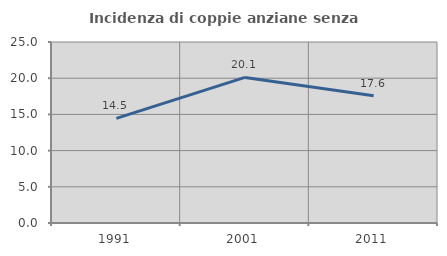
| Category | Incidenza di coppie anziane senza figli  |
|---|---|
| 1991.0 | 14.452 |
| 2001.0 | 20.11 |
| 2011.0 | 17.572 |